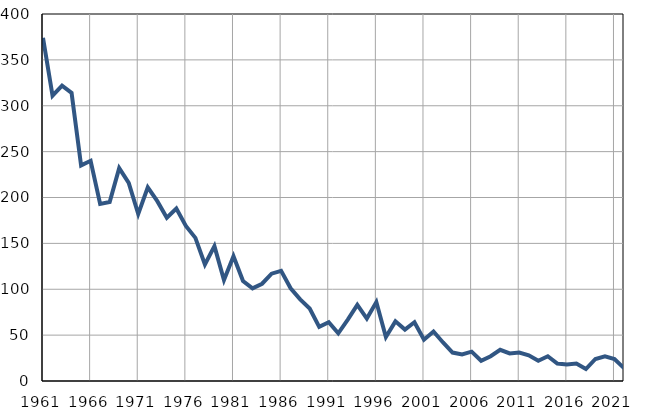
| Category | Infants
deaths |
|---|---|
| 1961.0 | 374 |
| 1962.0 | 311 |
| 1963.0 | 322 |
| 1964.0 | 314 |
| 1965.0 | 235 |
| 1966.0 | 240 |
| 1967.0 | 193 |
| 1968.0 | 195 |
| 1969.0 | 232 |
| 1970.0 | 216 |
| 1971.0 | 182 |
| 1972.0 | 211 |
| 1973.0 | 196 |
| 1974.0 | 178 |
| 1975.0 | 188 |
| 1976.0 | 169 |
| 1977.0 | 156 |
| 1978.0 | 127 |
| 1979.0 | 147 |
| 1980.0 | 110 |
| 1981.0 | 136 |
| 1982.0 | 109 |
| 1983.0 | 101 |
| 1984.0 | 106 |
| 1985.0 | 117 |
| 1986.0 | 120 |
| 1987.0 | 101 |
| 1988.0 | 89 |
| 1989.0 | 79 |
| 1990.0 | 59 |
| 1991.0 | 64 |
| 1992.0 | 52 |
| 1993.0 | 67 |
| 1994.0 | 83 |
| 1995.0 | 68 |
| 1996.0 | 86 |
| 1997.0 | 48 |
| 1998.0 | 65 |
| 1999.0 | 56 |
| 2000.0 | 64 |
| 2001.0 | 45 |
| 2002.0 | 54 |
| 2003.0 | 42 |
| 2004.0 | 31 |
| 2005.0 | 29 |
| 2006.0 | 32 |
| 2007.0 | 22 |
| 2008.0 | 27 |
| 2009.0 | 34 |
| 2010.0 | 30 |
| 2011.0 | 31 |
| 2012.0 | 28 |
| 2013.0 | 22 |
| 2014.0 | 27 |
| 2015.0 | 19 |
| 2016.0 | 18 |
| 2017.0 | 19 |
| 2018.0 | 13 |
| 2019.0 | 24 |
| 2020.0 | 27 |
| 2021.0 | 24 |
| 2022.0 | 14 |